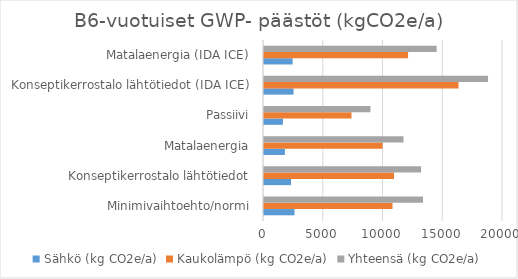
| Category | Sähkö (kg CO2e/a) | Kaukolämpö (kg CO2e/a) | Yhteensä (kg CO2e/a) |
|---|---|---|---|
| Minimivaihtoehto/normi | 2553.024 | 10754.415 | 13307.439 |
| Konseptikerrostalo lähtötiedot | 2263.44 | 10881.161 | 13144.601 |
| Matalaenergia | 1748.832 | 9923.574 | 11672.406 |
| Passiivi | 1586.496 | 7321.676 | 8908.172 |
| Konseptikerrostalo lähtötiedot (IDA ICE) | 2473.536 | 16275.003 | 18748.539 |
| Matalaenergia (IDA ICE) | 2394.816 | 12055.732 | 14450.548 |